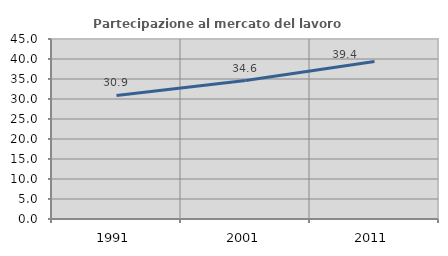
| Category | Partecipazione al mercato del lavoro  femminile |
|---|---|
| 1991.0 | 30.894 |
| 2001.0 | 34.621 |
| 2011.0 | 39.362 |